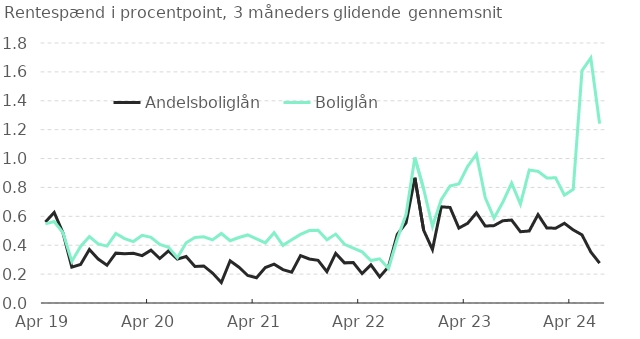
| Category | Andelsboliglån | Boliglån |
|---|---|---|
| 2019-04-01 | 0.561 | 0.548 |
| 2019-05-01 | 0.627 | 0.564 |
| 2019-06-01 | 0.485 | 0.487 |
| 2019-07-01 | 0.248 | 0.288 |
| 2019-08-01 | 0.267 | 0.392 |
| 2019-09-01 | 0.371 | 0.46 |
| 2019-10-01 | 0.304 | 0.41 |
| 2019-11-01 | 0.261 | 0.394 |
| 2019-12-01 | 0.345 | 0.481 |
| 2020-01-01 | 0.342 | 0.446 |
| 2020-02-01 | 0.344 | 0.425 |
| 2020-03-01 | 0.328 | 0.469 |
| 2020-04-01 | 0.366 | 0.455 |
| 2020-05-01 | 0.308 | 0.405 |
| 2020-06-01 | 0.361 | 0.386 |
| 2020-07-01 | 0.304 | 0.314 |
| 2020-08-01 | 0.322 | 0.417 |
| 2020-09-01 | 0.253 | 0.454 |
| 2020-10-01 | 0.257 | 0.458 |
| 2020-11-01 | 0.208 | 0.437 |
| 2020-12-01 | 0.142 | 0.481 |
| 2021-01-01 | 0.293 | 0.431 |
| 2021-02-01 | 0.247 | 0.453 |
| 2021-03-01 | 0.19 | 0.471 |
| 2021-04-01 | 0.175 | 0.445 |
| 2021-05-01 | 0.245 | 0.417 |
| 2021-06-01 | 0.269 | 0.487 |
| 2021-07-01 | 0.231 | 0.399 |
| 2021-08-01 | 0.214 | 0.437 |
| 2021-09-01 | 0.328 | 0.475 |
| 2021-10-01 | 0.304 | 0.501 |
| 2021-11-01 | 0.296 | 0.504 |
| 2021-12-01 | 0.216 | 0.438 |
| 2022-01-01 | 0.343 | 0.477 |
| 2022-02-01 | 0.278 | 0.407 |
| 2022-03-01 | 0.28 | 0.381 |
| 2022-04-01 | 0.203 | 0.354 |
| 2022-05-01 | 0.264 | 0.294 |
| 2022-06-01 | 0.181 | 0.306 |
| 2022-07-01 | 0.25 | 0.239 |
| 2022-08-01 | 0.475 | 0.443 |
| 2022-09-01 | 0.554 | 0.614 |
| 2022-10-01 | 0.867 | 1.007 |
| 2022-11-01 | 0.504 | 0.789 |
| 2022-12-01 | 0.37 | 0.53 |
| 2023-01-01 | 0.666 | 0.716 |
| 2023-02-01 | 0.661 | 0.81 |
| 2023-03-01 | 0.519 | 0.825 |
| 2023-04-01 | 0.552 | 0.946 |
| 2023-05-01 | 0.624 | 1.03 |
| 2023-06-01 | 0.533 | 0.729 |
| 2023-07-01 | 0.536 | 0.588 |
| 2023-08-01 | 0.569 | 0.698 |
| 2023-09-01 | 0.574 | 0.83 |
| 2023-10-01 | 0.493 | 0.684 |
| 2023-11-01 | 0.499 | 0.921 |
| 2023-12-01 | 0.612 | 0.912 |
| 2024-01-01 | 0.519 | 0.866 |
| 2024-02-01 | 0.518 | 0.867 |
| 2024-03-01 | 0.552 | 0.747 |
| 2024-04-01 | 0.506 | 0.787 |
| 2024-05-01 | 0.472 | 1.609 |
| 2024-06-01 | 0.353 | 1.696 |
| 2024-07-01 | 0.276 | 1.242 |